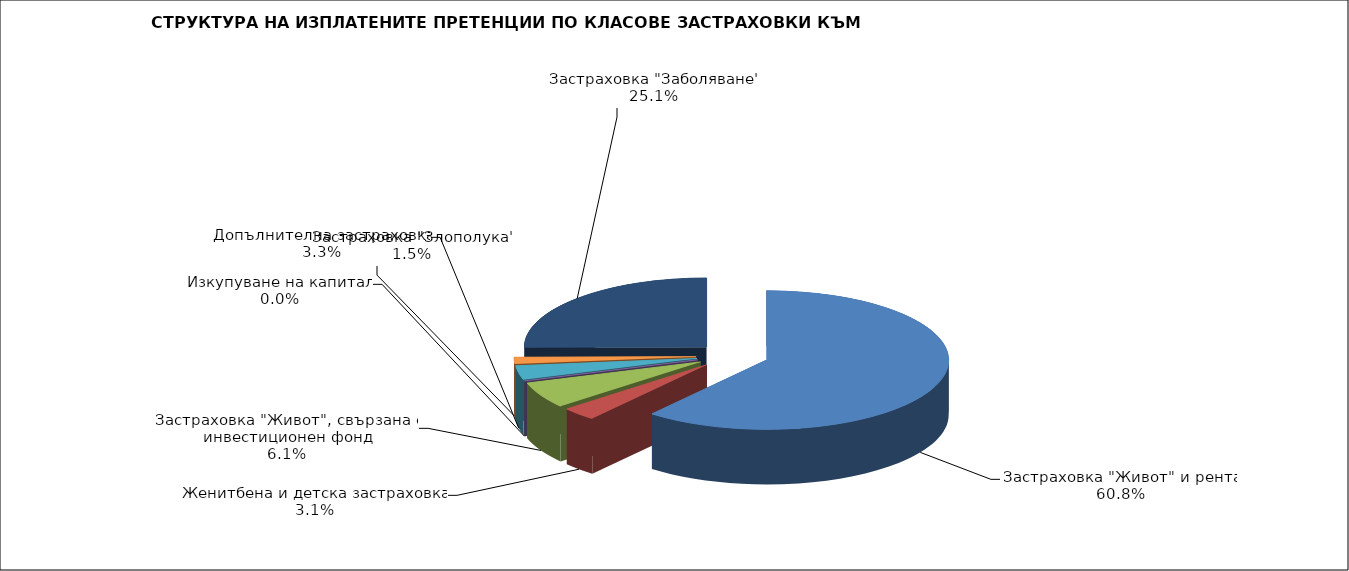
| Category | 67 315 015 |
|---|---|
| Застраховка "Живот" и рента | 67315015.366 |
| Женитбена и детска застраховка | 3463469.621 |
| Застраховка "Живот", свързана с инвестиционен фонд | 6740745.777 |
| Изкупуване на капитал | 0 |
| Допълнителна застраховка | 3611073.639 |
| Застраховка "Злополука" | 1712329.809 |
| Застраховка "Заболяване" | 27825953.923 |